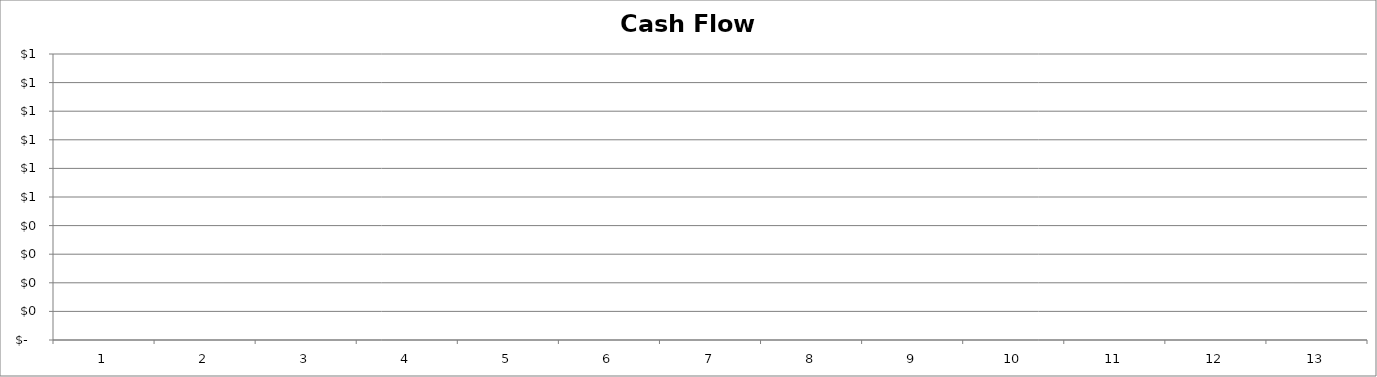
| Category | Cash Flow |
|---|---|
| 0 | 0 |
| 1 | 0 |
| 2 | 0 |
| 3 | 0 |
| 4 | 0 |
| 5 | 0 |
| 6 | 0 |
| 7 | 0 |
| 8 | 0 |
| 9 | 0 |
| 10 | 0 |
| 11 | 0 |
| 12 | 0 |